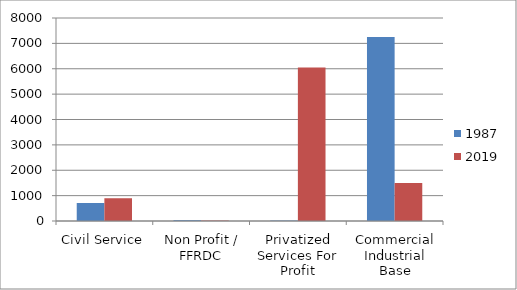
| Category | 1987 | 2019 |
|---|---|---|
| Civil Service | 710 | 897 |
| Non Profit / FFRDC | 32 | 17 |
| Privatized Services For Profit | 17 | 6052 |
| Commercial Industrial Base | 7250 | 1495 |